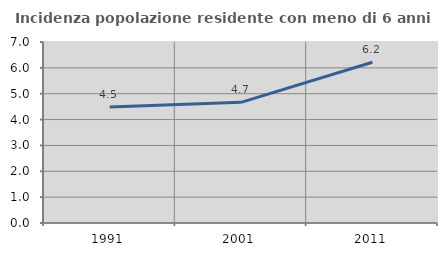
| Category | Incidenza popolazione residente con meno di 6 anni |
|---|---|
| 1991.0 | 4.488 |
| 2001.0 | 4.665 |
| 2011.0 | 6.216 |